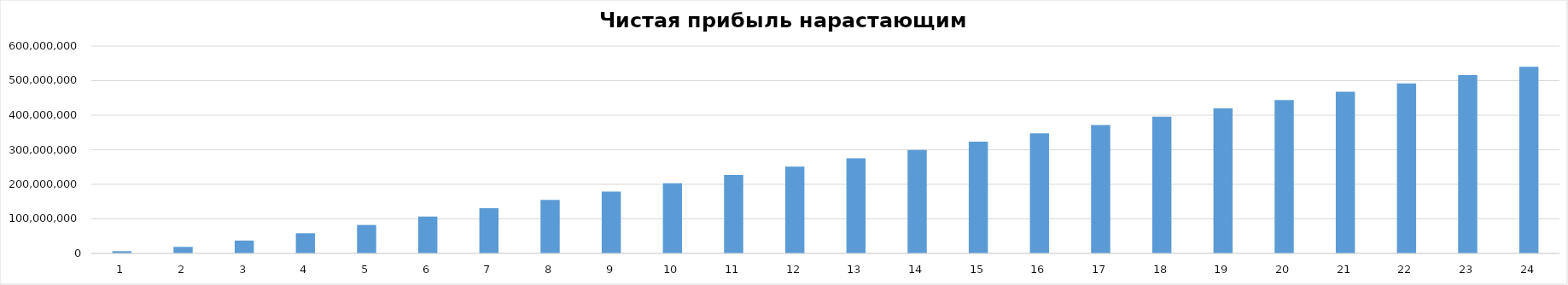
| Category | Чистая прибыль нарастающим итогом |
|---|---|
| 0 | 6563083.556 |
| 1 | 18967431.111 |
| 2 | 37213042.667 |
| 3 | 58379286.222 |
| 4 | 82466161.778 |
| 5 | 106553037.333 |
| 6 | 130639912.889 |
| 7 | 154726788.444 |
| 8 | 178813664 |
| 9 | 202900539.556 |
| 10 | 226987415.111 |
| 11 | 251074290.667 |
| 12 | 275161166.222 |
| 13 | 299248041.778 |
| 14 | 323334917.333 |
| 15 | 347421792.889 |
| 16 | 371508668.444 |
| 17 | 395595544 |
| 18 | 419682419.556 |
| 19 | 443769295.111 |
| 20 | 467856170.667 |
| 21 | 491943046.222 |
| 22 | 516029921.778 |
| 23 | 540116797.333 |